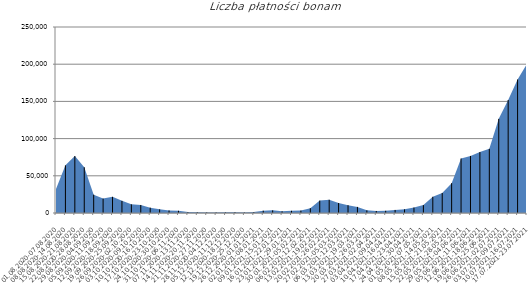
| Category | Liczba płatności bonami |
|---|---|
| 01.08.2020-07.08.2020 | 32125 |
| 08.08.2020-14.08.2020 | 64030 |
| 15.08.2020-21.08.2020 | 76533 |
| 22.08.2020-28.08.2020 | 61508 |
| 29.08.2020-04.09.2020 | 24618 |
| 05.09.2020-11.09.2020 | 19360 |
| 12.09.2020-18.09.2020 | 21708 |
| 19.09.2020-25.09.2020 | 16322 |
| 26.09.2020-02.10.2020 | 11615 |
| 03.10.2020-09.10.2020 | 10815 |
| 10.10.2020-16.10.2020 | 7159 |
| 17.10.2020-23.10.2020 | 4874 |
| 24.10.2020-30.10.2020 | 3464 |
| 31.10.2020-06.11.2020 | 3018 |
| 07.11.2020-13.11.2020 | 1231 |
| 14.11.2020-20.11.2020 | 1014 |
| 21.11.2020-27.11.2020 | 807 |
| 28.11.2020-04.12.2020 | 789 |
| 05.12.2020-11.12.2020 | 879 |
| 12.12.2020-18.12.2020 | 1146 |
| 19.12.2020-25.12.2020 | 694 |
| 26.12.2020-01.01.2021 | 1314 |
| 02.01.2021-08.01.2021 | 3108 |
| 09.01.2021-15.01.2021 | 3541 |
| 16.01.2021-22.01.2021 | 2297 |
| 23.01.2021-29.01.2021 | 2968 |
| 30.01.2021-05.02.2021 | 3254 |
| 06.02.2021-12.02.2021 | 6477 |
| 13.02.2021-19.02.2021 | 16636 |
| 20.02.2021-26.02.2021 | 17812 |
| 27.02.2021-05.03.2021 | 13421 |
| 06.03.2021-12.03.2021 | 10503 |
| 13.03.2021-19.03.2021 | 8206 |
| 20.03.2021-26.03.2021 | 3564 |
| 27.03.2021-02.04.2021 | 2734 |
| 03.04.2021-09.04.2021 | 2994 |
| 10.04.2021-16.04.2021 | 4163 |
| 17.04.2021-23.04.2021 | 4963 |
| 24.04.2021-30.04.2021 | 7333 |
| 01.05.2021-07.05.2021 | 10598 |
| 08.05.2021-14.05.2021 | 21766 |
| 15.05.2021-21.05.2021 | 26937 |
| 22.05.2021-28.05.2021 | 40099 |
| 29.05.2021-04.06.2021 | 73283 |
| 05.06.2021-11.06.2021 | 76691 |
| 12.06.2021-18.06.2021 | 81882 |
| 19.06.2021-25.06.2021 | 86248 |
| 26.06.2021-02.07.2021 | 126518 |
| 03.07.2021-09.07.2021 | 151849 |
| 10.07.2021-16.07.2021 | 179483 |
| 17.07.2021-23.07.2021 | 200422 |